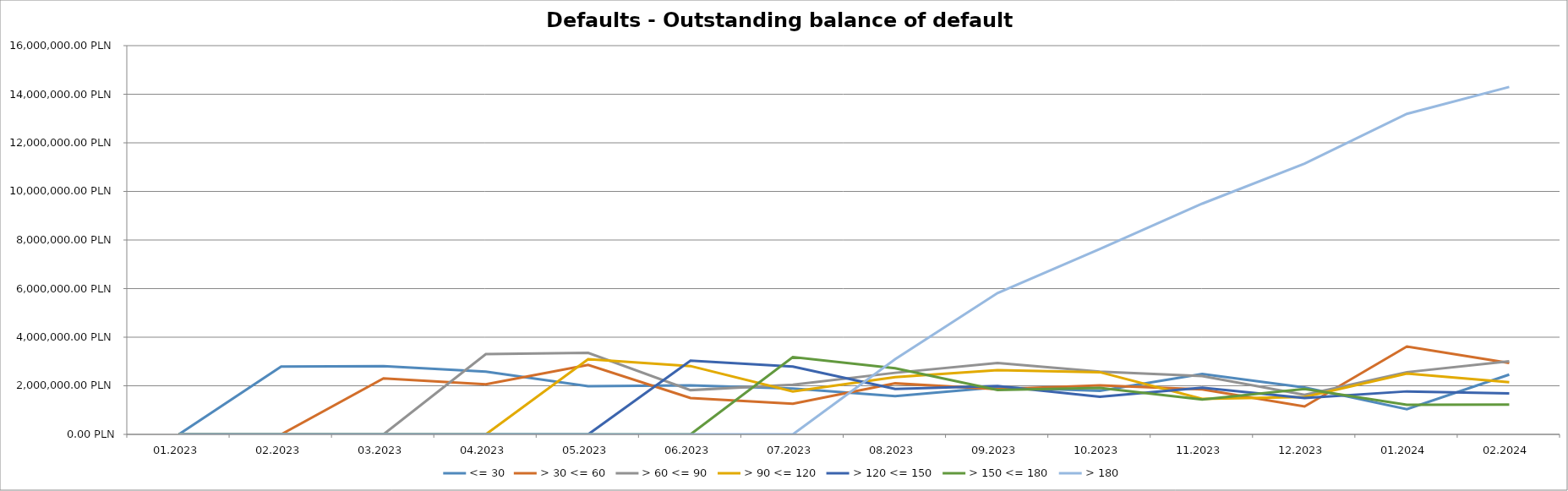
| Category | <= 30 | > 30 <= 60 | > 60 <= 90 | > 90 <= 120 | > 120 <= 150 | > 150 <= 180 | > 180 |
|---|---|---|---|---|---|---|---|
| 01.2023 | 0 | 0 | 0 | 0 | 0 | 0 | 0 |
| 02.2023 | 2788519.82 | 0 | 0 | 0 | 0 | 0 | 0 |
| 03.2023 | 2811517.14 | 2305154.07 | 0 | 0 | 0 | 0 | 0 |
| 04.2023 | 2584791.3 | 2064675.87 | 3301101.31 | 0 | 0 | 0 | 0 |
| 05.2023 | 1985441.56 | 2858398.5 | 3353485.78 | 3091988.77 | 0 | 0 | 0 |
| 06.2023 | 2016845.02 | 1496657.8 | 1822162.63 | 2812422.86 | 3037767.68 | 0 | 0 |
| 07.2023 | 1886118.05 | 1257979.4 | 2047168.21 | 1762916.26 | 2793763.11 | 3184053.47 | 0 |
| 08.2023 | 1572650.17 | 2099798.77 | 2534461.69 | 2357426.74 | 1871124.51 | 2723545.23 | 3093972.9 |
| 09.2023 | 1936023.84 | 1858916.55 | 2940706.37 | 2644290.89 | 1991761.95 | 1826544.8 | 5816448.05 |
| 10.2023 | 1787856.09 | 2019010.42 | 2585069.36 | 2560620.78 | 1548143.78 | 1909160.81 | 7632122.35 |
| 11.2023 | 2487439.47 | 1854213.59 | 2398255.83 | 1460739.8 | 1923073.63 | 1431220.99 | 9496137.88 |
| 12.2023 | 1933713.74 | 1149222.92 | 1628673.09 | 1540023.57 | 1499486.96 | 1871239.58 | 11143858.33 |
| 01.2024 | 1036575.14 | 3616872.94 | 2560909.55 | 2500120.14 | 1769512.28 | 1214846.09 | 13190834.36 |
| 02.2024 | 2461927.54 | 2941651.28 | 3011992.92 | 2150507.7 | 1685298.78 | 1226154.1 | 14300020.03 |